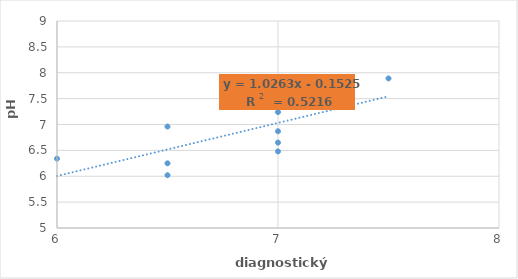
| Category | pH metr |
|---|---|
| 7.0 | 7.24 |
| 7.0 | 7.56 |
| 7.5 | 7.89 |
| 6.5 | 6.96 |
| 7.0 | 6.87 |
| 6.0 | 6.34 |
| 6.5 | 6.25 |
| 7.0 | 6.65 |
| 7.0 | 6.48 |
| 6.5 | 6.02 |